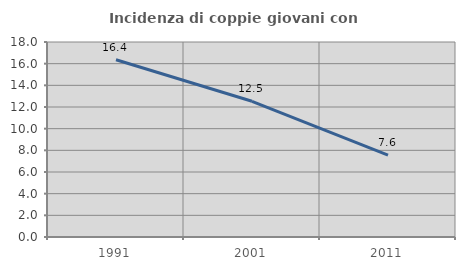
| Category | Incidenza di coppie giovani con figli |
|---|---|
| 1991.0 | 16.364 |
| 2001.0 | 12.527 |
| 2011.0 | 7.554 |